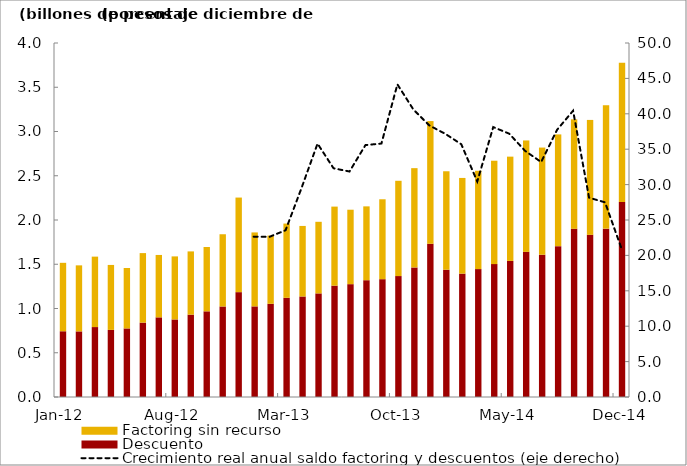
| Category | Descuento | Factoring sin recurso |
|---|---|---|
| 2012-01-31 | 0.743 | 0.773 |
| 2012-02-29 | 0.741 | 0.746 |
| 2012-03-31 | 0.79 | 0.796 |
| 2012-04-30 | 0.758 | 0.734 |
| 2012-05-31 | 0.775 | 0.683 |
| 2012-06-30 | 0.84 | 0.786 |
| 2012-07-31 | 0.9 | 0.705 |
| 2012-08-31 | 0.876 | 0.712 |
| 2012-09-30 | 0.93 | 0.715 |
| 2012-10-31 | 0.968 | 0.727 |
| 2012-11-30 | 1.023 | 0.816 |
| 2012-12-31 | 1.185 | 1.069 |
| 2013-01-31 | 1.024 | 0.836 |
| 2013-02-28 | 1.053 | 0.771 |
| 2013-03-31 | 1.121 | 0.839 |
| 2013-04-30 | 1.136 | 0.797 |
| 2013-05-31 | 1.171 | 0.809 |
| 2013-06-30 | 1.258 | 0.893 |
| 2013-07-31 | 1.275 | 0.841 |
| 2013-08-31 | 1.32 | 0.834 |
| 2013-09-30 | 1.331 | 0.903 |
| 2013-10-31 | 1.367 | 1.076 |
| 2013-11-30 | 1.464 | 1.122 |
| 2013-12-31 | 1.731 | 1.387 |
| 2014-01-31 | 1.438 | 1.113 |
| 2014-02-28 | 1.394 | 1.081 |
| 2014-03-31 | 1.445 | 1.111 |
| 2014-04-30 | 1.501 | 1.168 |
| 2014-05-31 | 1.538 | 1.178 |
| 2014-06-30 | 1.64 | 1.259 |
| 2014-07-31 | 1.608 | 1.211 |
| 2014-08-31 | 1.705 | 1.263 |
| 2014-09-30 | 1.9 | 1.237 |
| 2014-10-31 | 1.832 | 1.298 |
| 2014-11-30 | 1.902 | 1.394 |
| 2014-12-31 | 2.205 | 1.573 |